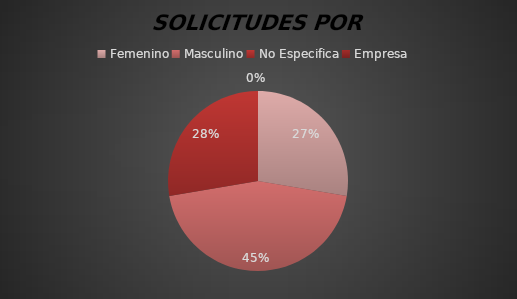
| Category | Series 0 |
|---|---|
| Femenino | 13 |
| Masculino | 21 |
| No Especifica | 13 |
| Empresa | 0 |